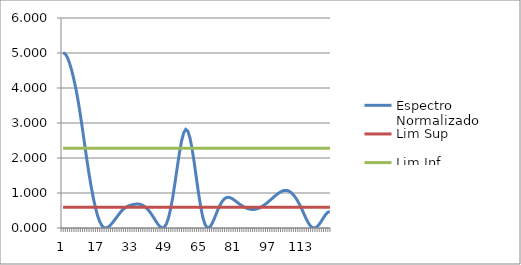
| Category | Espectro Normalizado | Lim Sup | Lim Inf |
|---|---|---|---|
| 0 | 5.01 | 0.596 | 2.281 |
| 1 | 4.975 | 0.596 | 2.281 |
| 2 | 4.873 | 0.596 | 2.281 |
| 3 | 4.712 | 0.596 | 2.281 |
| 4 | 4.502 | 0.596 | 2.281 |
| 5 | 4.252 | 0.596 | 2.281 |
| 6 | 3.963 | 0.596 | 2.281 |
| 7 | 3.629 | 0.596 | 2.281 |
| 8 | 3.247 | 0.596 | 2.281 |
| 9 | 2.83 | 0.596 | 2.281 |
| 10 | 2.4 | 0.596 | 2.281 |
| 11 | 1.974 | 0.596 | 2.281 |
| 12 | 1.571 | 0.596 | 2.281 |
| 13 | 1.201 | 0.596 | 2.281 |
| 14 | 0.872 | 0.596 | 2.281 |
| 15 | 0.59 | 0.596 | 2.281 |
| 16 | 0.361 | 0.596 | 2.281 |
| 17 | 0.187 | 0.596 | 2.281 |
| 18 | 0.071 | 0.596 | 2.281 |
| 19 | 0.012 | 0.596 | 2.281 |
| 20 | 0.001 | 0.596 | 2.281 |
| 21 | 0.028 | 0.596 | 2.281 |
| 22 | 0.082 | 0.596 | 2.281 |
| 23 | 0.153 | 0.596 | 2.281 |
| 24 | 0.234 | 0.596 | 2.281 |
| 25 | 0.318 | 0.596 | 2.281 |
| 26 | 0.399 | 0.596 | 2.281 |
| 27 | 0.474 | 0.596 | 2.281 |
| 28 | 0.537 | 0.596 | 2.281 |
| 29 | 0.585 | 0.596 | 2.281 |
| 30 | 0.62 | 0.596 | 2.281 |
| 31 | 0.645 | 0.596 | 2.281 |
| 32 | 0.663 | 0.596 | 2.281 |
| 33 | 0.676 | 0.596 | 2.281 |
| 34 | 0.683 | 0.596 | 2.281 |
| 35 | 0.683 | 0.596 | 2.281 |
| 36 | 0.673 | 0.596 | 2.281 |
| 37 | 0.648 | 0.596 | 2.281 |
| 38 | 0.609 | 0.596 | 2.281 |
| 39 | 0.554 | 0.596 | 2.281 |
| 40 | 0.484 | 0.596 | 2.281 |
| 41 | 0.401 | 0.596 | 2.281 |
| 42 | 0.307 | 0.596 | 2.281 |
| 43 | 0.209 | 0.596 | 2.281 |
| 44 | 0.115 | 0.596 | 2.281 |
| 45 | 0.039 | 0.596 | 2.281 |
| 46 | 0.001 | 0.596 | 2.281 |
| 47 | 0.021 | 0.596 | 2.281 |
| 48 | 0.115 | 0.596 | 2.281 |
| 49 | 0.292 | 0.596 | 2.281 |
| 50 | 0.555 | 0.596 | 2.281 |
| 51 | 0.894 | 0.596 | 2.281 |
| 52 | 1.29 | 0.596 | 2.281 |
| 53 | 1.712 | 0.596 | 2.281 |
| 54 | 2.121 | 0.596 | 2.281 |
| 55 | 2.47 | 0.596 | 2.281 |
| 56 | 2.714 | 0.596 | 2.281 |
| 57 | 2.816 | 0.596 | 2.281 |
| 58 | 2.764 | 0.596 | 2.281 |
| 59 | 2.566 | 0.596 | 2.281 |
| 60 | 2.247 | 0.596 | 2.281 |
| 61 | 1.846 | 0.596 | 2.281 |
| 62 | 1.405 | 0.596 | 2.281 |
| 63 | 0.971 | 0.596 | 2.281 |
| 64 | 0.588 | 0.596 | 2.281 |
| 65 | 0.29 | 0.596 | 2.281 |
| 66 | 0.095 | 0.596 | 2.281 |
| 67 | 0.007 | 0.596 | 2.281 |
| 68 | 0.016 | 0.596 | 2.281 |
| 69 | 0.099 | 0.596 | 2.281 |
| 70 | 0.228 | 0.596 | 2.281 |
| 71 | 0.379 | 0.596 | 2.281 |
| 72 | 0.529 | 0.596 | 2.281 |
| 73 | 0.662 | 0.596 | 2.281 |
| 74 | 0.766 | 0.596 | 2.281 |
| 75 | 0.836 | 0.596 | 2.281 |
| 76 | 0.871 | 0.596 | 2.281 |
| 77 | 0.877 | 0.596 | 2.281 |
| 78 | 0.858 | 0.596 | 2.281 |
| 79 | 0.822 | 0.596 | 2.281 |
| 80 | 0.777 | 0.596 | 2.281 |
| 81 | 0.729 | 0.596 | 2.281 |
| 82 | 0.684 | 0.596 | 2.281 |
| 83 | 0.642 | 0.596 | 2.281 |
| 84 | 0.604 | 0.596 | 2.281 |
| 85 | 0.573 | 0.596 | 2.281 |
| 86 | 0.55 | 0.596 | 2.281 |
| 87 | 0.534 | 0.596 | 2.281 |
| 88 | 0.528 | 0.596 | 2.281 |
| 89 | 0.531 | 0.596 | 2.281 |
| 90 | 0.545 | 0.596 | 2.281 |
| 91 | 0.568 | 0.596 | 2.281 |
| 92 | 0.599 | 0.596 | 2.281 |
| 93 | 0.638 | 0.596 | 2.281 |
| 94 | 0.681 | 0.596 | 2.281 |
| 95 | 0.73 | 0.596 | 2.281 |
| 96 | 0.782 | 0.596 | 2.281 |
| 97 | 0.836 | 0.596 | 2.281 |
| 98 | 0.889 | 0.596 | 2.281 |
| 99 | 0.941 | 0.596 | 2.281 |
| 100 | 0.988 | 0.596 | 2.281 |
| 101 | 1.029 | 0.596 | 2.281 |
| 102 | 1.059 | 0.596 | 2.281 |
| 103 | 1.075 | 0.596 | 2.281 |
| 104 | 1.074 | 0.596 | 2.281 |
| 105 | 1.052 | 0.596 | 2.281 |
| 106 | 1.011 | 0.596 | 2.281 |
| 107 | 0.951 | 0.596 | 2.281 |
| 108 | 0.871 | 0.596 | 2.281 |
| 109 | 0.773 | 0.596 | 2.281 |
| 110 | 0.659 | 0.596 | 2.281 |
| 111 | 0.53 | 0.596 | 2.281 |
| 112 | 0.393 | 0.596 | 2.281 |
| 113 | 0.259 | 0.596 | 2.281 |
| 114 | 0.142 | 0.596 | 2.281 |
| 115 | 0.055 | 0.596 | 2.281 |
| 116 | 0.008 | 0.596 | 2.281 |
| 117 | 0.003 | 0.596 | 2.281 |
| 118 | 0.037 | 0.596 | 2.281 |
| 119 | 0.103 | 0.596 | 2.281 |
| 120 | 0.193 | 0.596 | 2.281 |
| 121 | 0.291 | 0.596 | 2.281 |
| 122 | 0.383 | 0.596 | 2.281 |
| 123 | 0.449 | 0.596 | 2.281 |
| 124 | 0.473 | 0.596 | 2.281 |